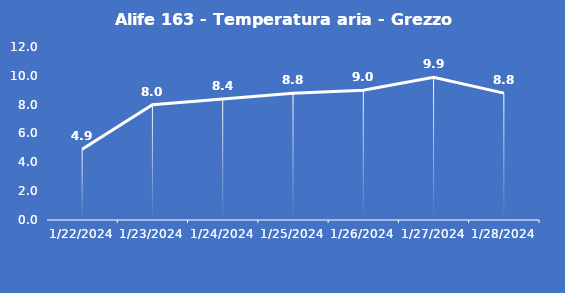
| Category | Alife 163 - Temperatura aria - Grezzo (°C) |
|---|---|
| 1/22/24 | 4.9 |
| 1/23/24 | 8 |
| 1/24/24 | 8.4 |
| 1/25/24 | 8.8 |
| 1/26/24 | 9 |
| 1/27/24 | 9.9 |
| 1/28/24 | 8.8 |